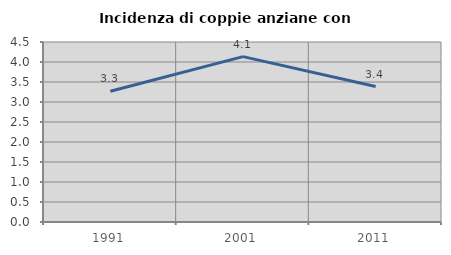
| Category | Incidenza di coppie anziane con figli |
|---|---|
| 1991.0 | 3.27 |
| 2001.0 | 4.134 |
| 2011.0 | 3.385 |